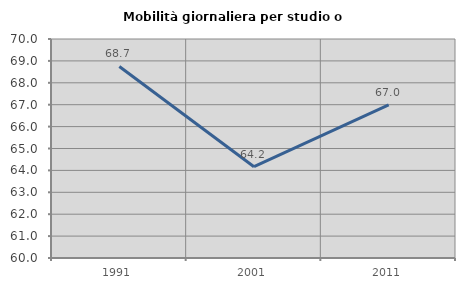
| Category | Mobilità giornaliera per studio o lavoro |
|---|---|
| 1991.0 | 68.745 |
| 2001.0 | 64.168 |
| 2011.0 | 66.991 |